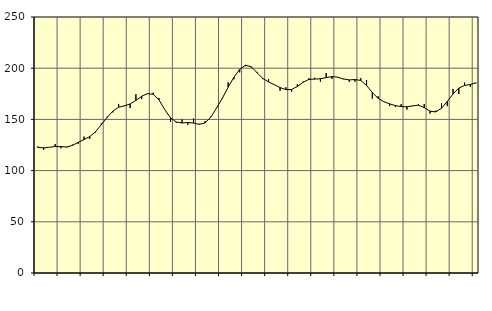
| Category | Piggar | Series 1 |
|---|---|---|
| nan | 123.7 | 122.5 |
| 1.0 | 120.2 | 122.26 |
| 1.0 | 122.8 | 122.79 |
| 1.0 | 125.9 | 123.54 |
| nan | 121.8 | 123.4 |
| 2.0 | 122.5 | 123.05 |
| 2.0 | 125.4 | 124.64 |
| 2.0 | 126.1 | 127.61 |
| nan | 133.2 | 130.32 |
| 3.0 | 130.9 | 133.26 |
| 3.0 | 137.3 | 137.93 |
| 3.0 | 146.1 | 144.79 |
| nan | 152.6 | 151.93 |
| 4.0 | 156.8 | 158.08 |
| 4.0 | 165.1 | 161.92 |
| 4.0 | 163.7 | 163.23 |
| nan | 161.1 | 165.12 |
| 5.0 | 174.5 | 168.56 |
| 5.0 | 169.8 | 172.62 |
| 5.0 | 175.4 | 175.14 |
| nan | 176.1 | 174.48 |
| 6.0 | 170.9 | 169.08 |
| 6.0 | 159.6 | 159.63 |
| 6.0 | 147.5 | 151.57 |
| nan | 146.8 | 147.47 |
| 7.0 | 149.9 | 146.49 |
| 7.0 | 144.7 | 147.03 |
| 7.0 | 150.8 | 146.4 |
| nan | 145.7 | 145.19 |
| 8.0 | 148.3 | 146.56 |
| 8.0 | 152.7 | 152.31 |
| 8.0 | 161.5 | 161.21 |
| nan | 170.4 | 170.77 |
| 9.0 | 186.3 | 181.45 |
| 9.0 | 189.2 | 191.17 |
| 9.0 | 195.9 | 198.88 |
| nan | 202 | 202.94 |
| 10.0 | 200.8 | 201.42 |
| 10.0 | 196.4 | 195.61 |
| 10.0 | 189.4 | 190 |
| nan | 189.3 | 186.62 |
| 11.0 | 184.3 | 183.92 |
| 11.0 | 178 | 181.12 |
| 11.0 | 181.4 | 179.01 |
| nan | 177 | 179.23 |
| 12.0 | 184.3 | 182.12 |
| 12.0 | 186.9 | 186.29 |
| 12.0 | 190.2 | 189.03 |
| nan | 190.7 | 189.37 |
| 13.0 | 186.9 | 189.66 |
| 13.0 | 195.2 | 190.79 |
| 13.0 | 189.6 | 191.82 |
| nan | 191 | 191.21 |
| 14.0 | 189.2 | 189.51 |
| 14.0 | 186.6 | 188.56 |
| 14.0 | 186.9 | 188.93 |
| nan | 190.2 | 188.04 |
| 15.0 | 188.4 | 183.2 |
| 15.0 | 170.3 | 176.21 |
| 15.0 | 172.6 | 170.61 |
| nan | 167.4 | 167.27 |
| 16.0 | 163 | 165.18 |
| 16.0 | 162 | 163.5 |
| 16.0 | 164.9 | 162.53 |
| nan | 159.6 | 162.32 |
| 17.0 | 163 | 163.23 |
| 17.0 | 165.1 | 163.89 |
| 17.0 | 165 | 161.52 |
| nan | 155.7 | 158.05 |
| 18.0 | 158.6 | 157.3 |
| 18.0 | 165.6 | 160.88 |
| 18.0 | 163 | 167.55 |
| nan | 179.7 | 174.8 |
| 19.0 | 174.8 | 180.63 |
| 19.0 | 185.9 | 183.15 |
| 19.0 | 181.7 | 184.14 |
| nan | 185.3 | 185.76 |